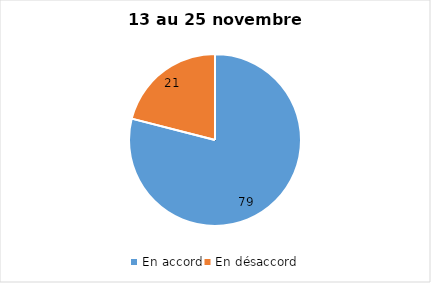
| Category | Series 0 |
|---|---|
| En accord | 79 |
| En désaccord | 21 |